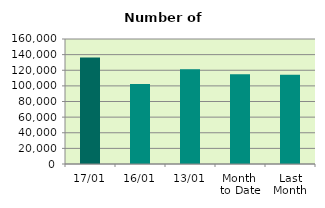
| Category | Series 0 |
|---|---|
| 17/01 | 136190 |
| 16/01 | 102246 |
| 13/01 | 121224 |
| Month 
to Date | 114859.167 |
| Last
Month | 114251.429 |